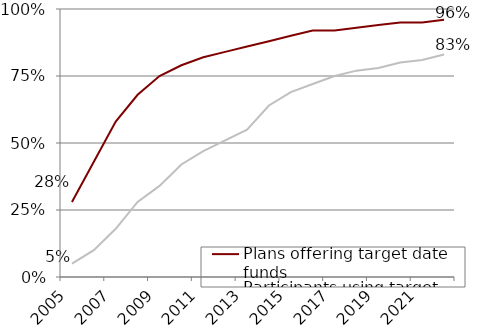
| Category | Plans offering target date funds | Participants using target date funds |
|---|---|---|
| 2005.0 | 0.28 | 0.05 |
| 2006.0 | 0.43 | 0.1 |
| 2007.0 | 0.58 | 0.18 |
| 2008.0 | 0.68 | 0.28 |
| 2009.0 | 0.75 | 0.34 |
| 2010.0 | 0.79 | 0.42 |
| 2011.0 | 0.82 | 0.47 |
| 2012.0 | 0.84 | 0.51 |
| 2013.0 | 0.86 | 0.55 |
| 2014.0 | 0.88 | 0.64 |
| 2015.0 | 0.9 | 0.69 |
| 2016.0 | 0.92 | 0.72 |
| 2017.0 | 0.92 | 0.75 |
| 2018.0 | 0.93 | 0.77 |
| 2019.0 | 0.94 | 0.78 |
| 2020.0 | 0.95 | 0.8 |
| 2021.0 | 0.95 | 0.81 |
| 2022.0 | 0.96 | 0.83 |